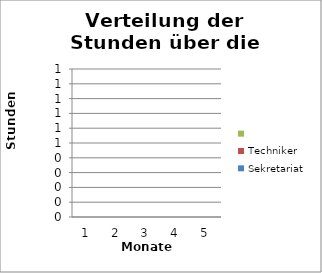
| Category | Sekretariat | Techniker | Series 1 |
|---|---|---|---|
| 1.0 | 0 | 0 | 0 |
| 2.0 | 0 | 0 | 0 |
| 3.0 | 0 | 0 | 0 |
| 4.0 | 0 | 0 | 0 |
| 5.0 | 0 | 0 | 0 |